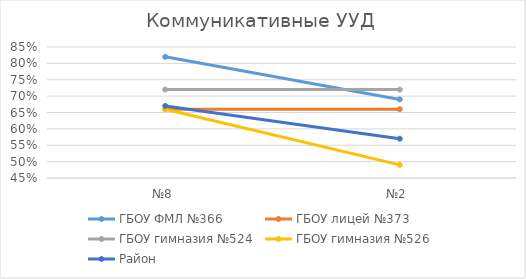
| Category | ГБОУ ФМЛ №366 | ГБОУ лицей №373 | ГБОУ гимназия №524 | ГБОУ гимназия №526 | Район |
|---|---|---|---|---|---|
| №8 | 0.82 | 0.66 | 0.72 | 0.66 | 0.67 |
| №2 | 0.69 | 0.66 | 0.72 | 0.49 | 0.57 |